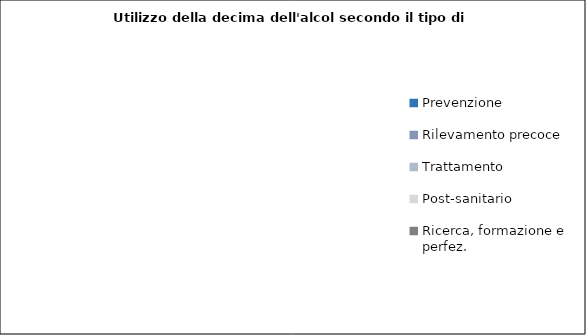
| Category | Series 0 |
|---|---|
| Prevenzione | 0 |
| Rilevamento precoce | 0 |
| Trattamento | 0 |
| Post-sanitario | 0 |
| Ricerca, formazione e perfez. | 0 |